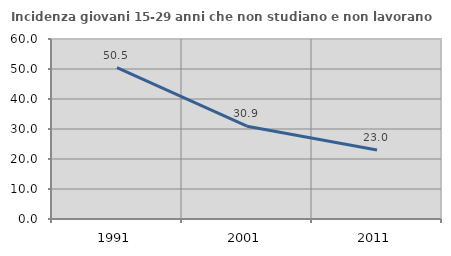
| Category | Incidenza giovani 15-29 anni che non studiano e non lavorano  |
|---|---|
| 1991.0 | 50.495 |
| 2001.0 | 30.942 |
| 2011.0 | 22.976 |